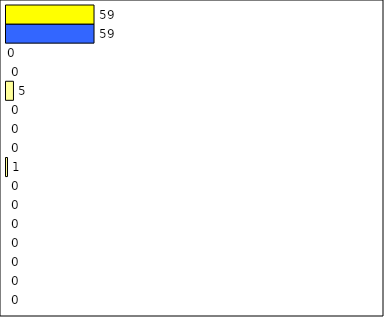
| Category | -2 | -1 | 0 | 1 | 2 | 3 | 4 | 5 | 6 | 7 | 8 | 9 | 10 | 11 | 12 | Perfect Round |
|---|---|---|---|---|---|---|---|---|---|---|---|---|---|---|---|---|
| 0 | 0 | 0 | 0 | 0 | 0 | 0 | 0 | 1 | 0 | 0 | 0 | 5 | 0 | 0 | 59 | 59 |